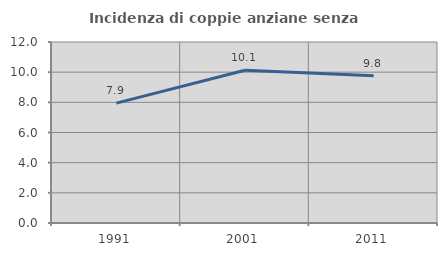
| Category | Incidenza di coppie anziane senza figli  |
|---|---|
| 1991.0 | 7.95 |
| 2001.0 | 10.127 |
| 2011.0 | 9.768 |